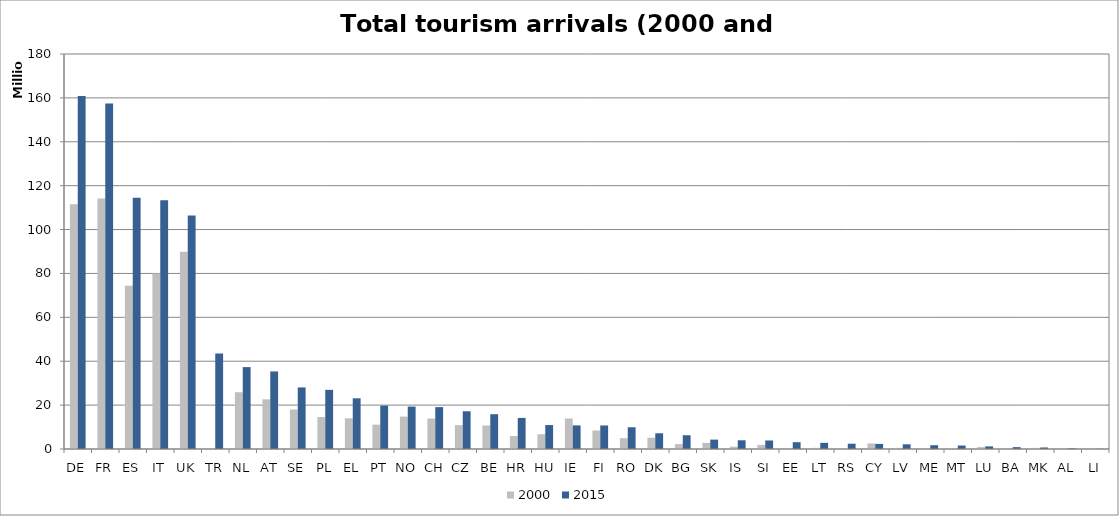
| Category | 2000 | 2015 |
|---|---|---|
| DE | 111492424 | 160893747 |
| FR | 114110689 | 157492941 |
| ES | 74408937 | 114448411 |
| IT | 80031637 | 113354674 |
| UK | 89855000 | 106421227 |
| TR | 0 | 43514295 |
| NL | 25875000 | 37318438 |
| AT | 22649293 | 35350102 |
| SE | 18013505 | 28056573 |
| PL | 14560133 | 26942056 |
| EL | 13976386 | 23099844 |
| PT | 11098727 | 19780195 |
| NO | 14771780 | 19333135 |
| CH | 13893817 | 19090000 |
| CZ | 10863772 | 17195550 |
| BE | 10723864 | 15846926 |
| HR | 5921998 | 14157026 |
| HU | 6731870 | 10913250 |
| IE | 13895000 | 10755648 |
| FI | 8431087 | 10734841 |
| RO | 4920128 | 9898557 |
| DK | 5126675 | 7164604 |
| BG | 2232667 | 6279036 |
| SK | 2780030 | 4274035 |
| IS | 1051319 | 3978084 |
| SI | 1884327 | 3878223 |
| EE | 0 | 3112143 |
| LT | 517810 | 2805808 |
| RS | 0 | 2409267 |
| CY | 2519525 | 2315875 |
| LV | 513567 | 2139393 |
| ME | 0 | 1713109 |
| MT | 0 | 1586068 |
| LU | 890267 | 1196117 |
| BA | 395318 | 846581 |
| MK | 507362 | 698684 |
| AL | 165000 | 297000 |
| LI | 77780 | 57649 |